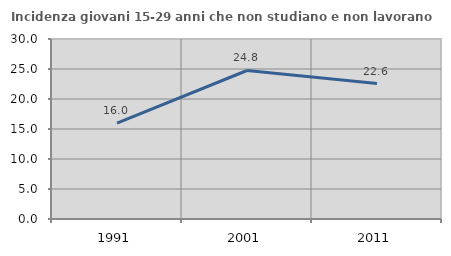
| Category | Incidenza giovani 15-29 anni che non studiano e non lavorano  |
|---|---|
| 1991.0 | 15.986 |
| 2001.0 | 24.752 |
| 2011.0 | 22.581 |